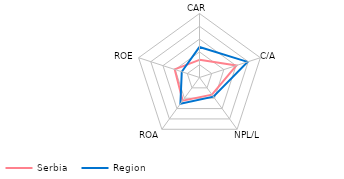
| Category | Serbia | Region |
|---|---|---|
| CAR | 1.38 | 2.389 |
| C/A | 3.035 | 3.946 |
| NPL/L | 1.654 | 1.853 |
| ROA | 2.234 | 2.536 |
| ROE | 2.038 | 1.457 |